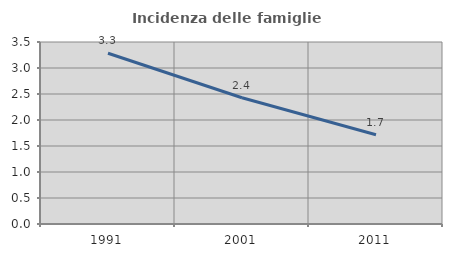
| Category | Incidenza delle famiglie numerose |
|---|---|
| 1991.0 | 3.283 |
| 2001.0 | 2.427 |
| 2011.0 | 1.717 |